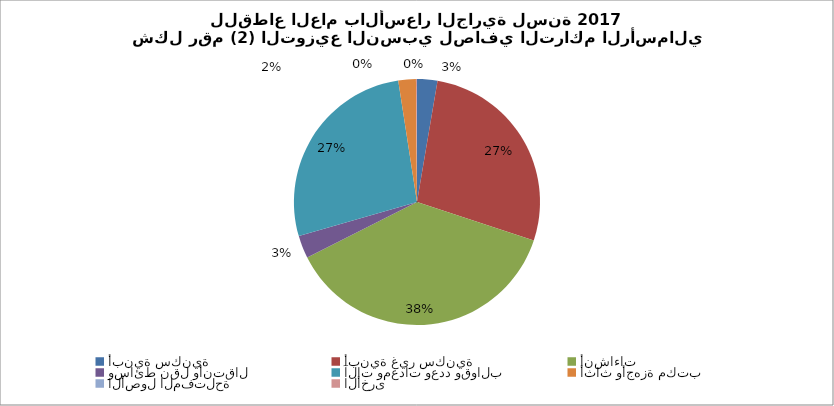
| Category | Series 0 |
|---|---|
| أبنية سكنية | 4905483.635 |
| أبنية غير سكنية | 50278531.557 |
| أنشاءات | 68758839.962 |
| وسائط نقل وأنتقال | 5454804.366 |
| آلات ومعدات وعدد وقوالب | 49575130.298 |
| أثاث وأجهزة مكتب | 4228523.088 |
| الأصول المفتلحة | 20163.945 |
| الأخرى  | 229114.805 |